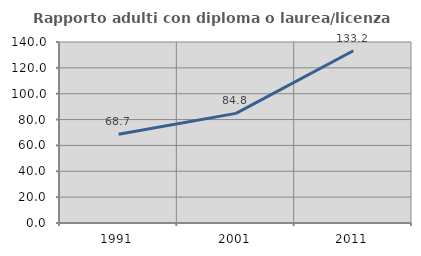
| Category | Rapporto adulti con diploma o laurea/licenza media  |
|---|---|
| 1991.0 | 68.663 |
| 2001.0 | 84.798 |
| 2011.0 | 133.247 |